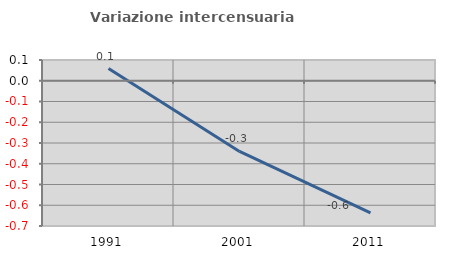
| Category | Variazione intercensuaria annua |
|---|---|
| 1991.0 | 0.059 |
| 2001.0 | -0.34 |
| 2011.0 | -0.637 |